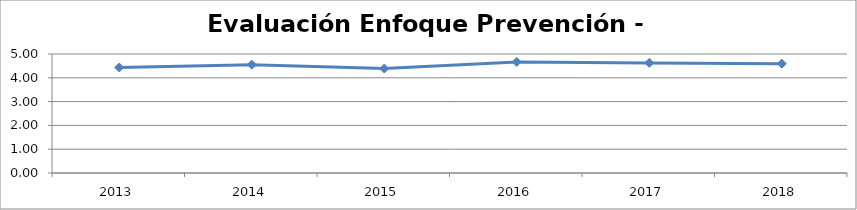
| Category | Series 0 |
|---|---|
| 2013.0 | 4.433 |
| 2014.0 | 4.553 |
| 2015.0 | 4.39 |
| 2016.0 | 4.667 |
| 2017.0 | 4.627 |
| 2018.0 | 4.593 |